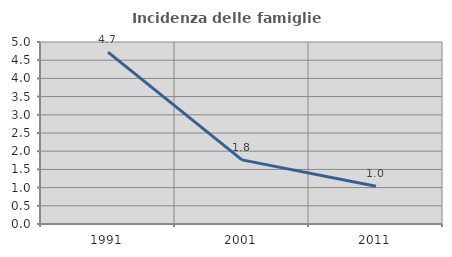
| Category | Incidenza delle famiglie numerose |
|---|---|
| 1991.0 | 4.723 |
| 2001.0 | 1.762 |
| 2011.0 | 1.037 |